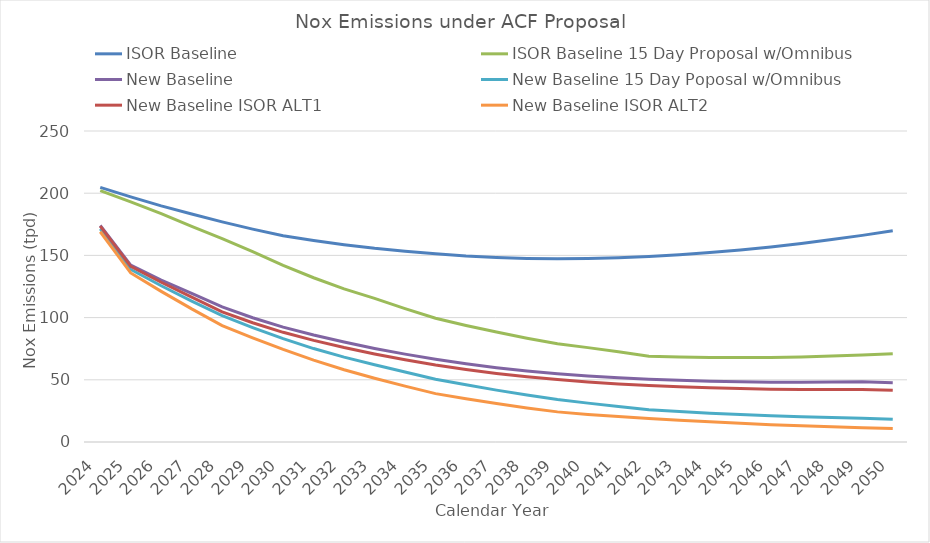
| Category | ISOR Baseline | ISOR Baseline 15 Day Proposal w/Omnibus | New Baseline | New Baseline 15 Day Poposal w/Omnibus | New Baseline ISOR ALT1 | New Baseline ISOR ALT2 |
|---|---|---|---|---|---|---|
| 2024.0 | 204.737 | 202.118 | 174.019 | 171.312 | 173.604 | 169.024 |
| 2025.0 | 197.005 | 193.092 | 142.12 | 138.708 | 141.142 | 135.864 |
| 2026.0 | 189.834 | 183.668 | 130.085 | 125.575 | 128.434 | 121.105 |
| 2027.0 | 183.268 | 173.395 | 119.431 | 113.204 | 116.538 | 106.983 |
| 2028.0 | 176.95 | 163.551 | 108.537 | 101.589 | 104.637 | 93.633 |
| 2029.0 | 171.107 | 152.938 | 99.86 | 92.018 | 95.853 | 83.756 |
| 2030.0 | 165.829 | 141.924 | 92.321 | 83.04 | 88.177 | 74.437 |
| 2031.0 | 161.952 | 132.038 | 85.988 | 75.115 | 81.708 | 65.824 |
| 2032.0 | 158.569 | 123.09 | 80.318 | 68.205 | 75.901 | 58.121 |
| 2033.0 | 155.657 | 115.452 | 75.202 | 62.156 | 70.733 | 51.265 |
| 2034.0 | 153.294 | 107.187 | 70.635 | 56.236 | 66.116 | 44.907 |
| 2035.0 | 151.347 | 99.488 | 66.512 | 50.478 | 61.903 | 38.891 |
| 2036.0 | 149.582 | 93.673 | 62.849 | 45.962 | 58.282 | 34.697 |
| 2037.0 | 148.379 | 88.356 | 59.716 | 41.711 | 55.138 | 30.868 |
| 2038.0 | 147.598 | 83.464 | 57.062 | 37.773 | 52.439 | 27.392 |
| 2039.0 | 147.327 | 78.972 | 54.866 | 34.126 | 50.159 | 24.215 |
| 2040.0 | 147.456 | 75.871 | 53.019 | 31.244 | 48.2 | 22.18 |
| 2041.0 | 148.06 | 72.638 | 51.571 | 28.54 | 46.623 | 20.405 |
| 2042.0 | 149.069 | 68.904 | 50.413 | 25.854 | 45.33 | 18.824 |
| 2043.0 | 150.605 | 68.428 | 49.649 | 24.552 | 44.426 | 17.576 |
| 2044.0 | 152.286 | 68.011 | 48.896 | 23.204 | 43.528 | 16.232 |
| 2045.0 | 154.427 | 67.987 | 48.458 | 22.123 | 42.939 | 15.094 |
| 2046.0 | 156.806 | 68.012 | 48.113 | 21.067 | 42.442 | 13.939 |
| 2047.0 | 159.609 | 68.422 | 48.052 | 20.285 | 42.228 | 13.028 |
| 2048.0 | 162.695 | 69.056 | 48.143 | 19.62 | 42.158 | 12.21 |
| 2049.0 | 166.106 | 69.959 | 48.436 | 19.132 | 42.273 | 11.545 |
| 2050.0 | 169.747 | 70.991 | 47.629 | 18.334 | 41.518 | 10.76 |